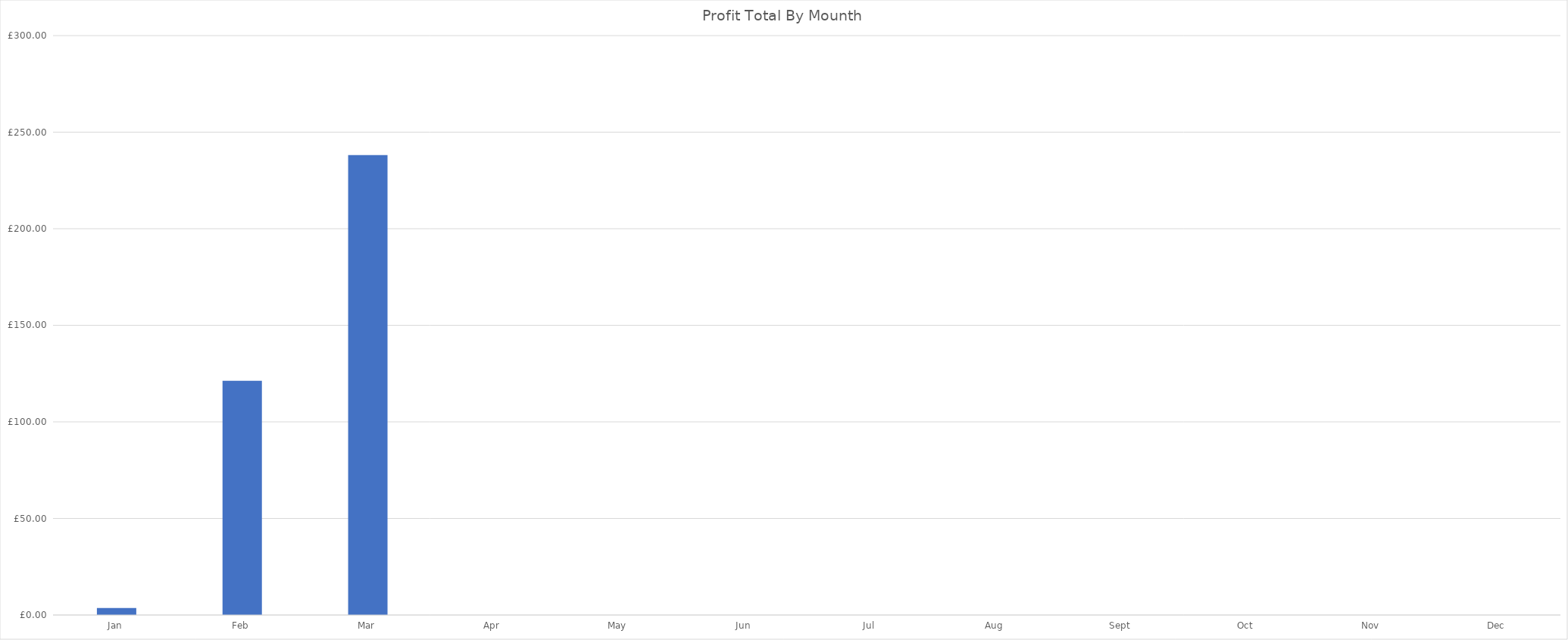
| Category | Profit Total By Mounth |
|---|---|
| 2021-01-01 | 3.6 |
| 2021-02-01 | 121.23 |
| 2021-03-01 | 238.17 |
| 2021-04-01 | 0 |
| 2021-05-01 | 0 |
| 2021-06-01 | 0 |
| 2021-07-01 | 0 |
| 2021-08-01 | 0 |
| 2021-09-01 | 0 |
| 2021-10-01 | 0 |
| 2021-11-01 | 0 |
| 2021-12-01 | 0 |